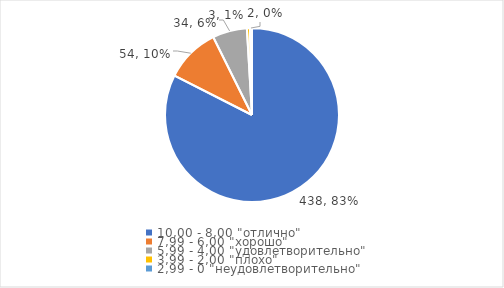
| Category | Series 0 | Series 1 |
|---|---|---|
| 10,00 - 8,00 "отлично" | 438 | 0.825 |
| 7,99 - 6,00 "хорошо" | 54 | 0.102 |
| 5,99 - 4,00 "удовлетворительно" | 34 | 0.064 |
| 3,99 - 2,00 "плохо" | 3 | 0.006 |
| 2,99 - 0 "неудовлетворительно" | 2 | 0.004 |